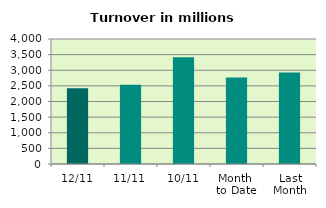
| Category | Series 0 |
|---|---|
| 12/11 | 2424.83 |
| 11/11 | 2538.38 |
| 10/11 | 3415.877 |
| Month 
to Date | 2768.562 |
| Last
Month | 2924.951 |